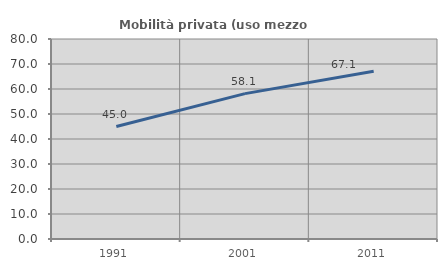
| Category | Mobilità privata (uso mezzo privato) |
|---|---|
| 1991.0 | 44.984 |
| 2001.0 | 58.147 |
| 2011.0 | 67.06 |